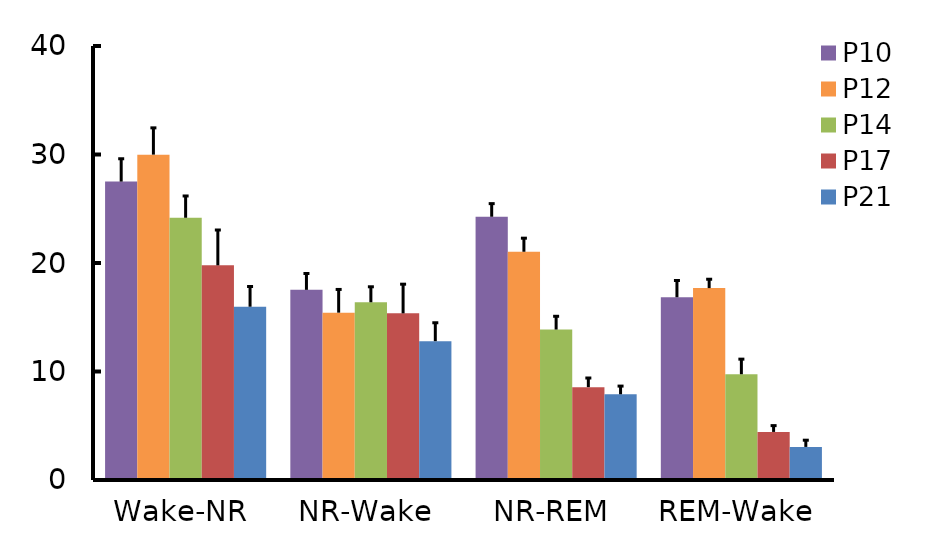
| Category | P10 | P12 | P14 | P17 | P21 |
|---|---|---|---|---|---|
| Wake-NR | 27.504 | 29.988 | 24.169 | 19.785 | 15.971 |
| NR-Wake | 17.526 | 15.423 | 16.381 | 15.361 | 12.795 |
| NR-REM | 24.263 | 21.036 | 13.866 | 8.558 | 7.902 |
| REM-Wake | 16.843 | 17.686 | 9.747 | 4.431 | 3.049 |